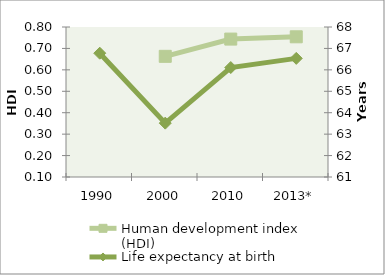
| Category | Human development index (HDI) |
|---|---|
| 1990 | 0 |
| 2000 | 0.663 |
| 2010 | 0.744 |
| 2013* | 0.754 |